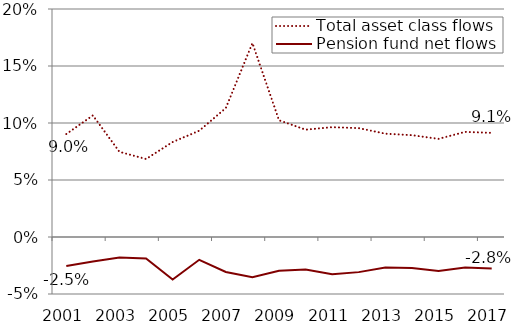
| Category | Total asset class flows | Pension fund net flows |
|---|---|---|
| 2001.0 | 0.09 | -0.025 |
| 2002.0 | 0.107 | -0.021 |
| 2003.0 | 0.075 | -0.018 |
| 2004.0 | 0.068 | -0.019 |
| 2005.0 | 0.083 | -0.037 |
| 2006.0 | 0.093 | -0.02 |
| 2007.0 | 0.113 | -0.031 |
| 2008.0 | 0.17 | -0.035 |
| 2009.0 | 0.102 | -0.03 |
| 2010.0 | 0.094 | -0.028 |
| 2011.0 | 0.096 | -0.033 |
| 2012.0 | 0.095 | -0.031 |
| 2013.0 | 0.091 | -0.027 |
| 2014.0 | 0.089 | -0.027 |
| 2015.0 | 0.086 | -0.03 |
| 2016.0 | 0.092 | -0.027 |
| 2017.0 | 0.091 | -0.028 |